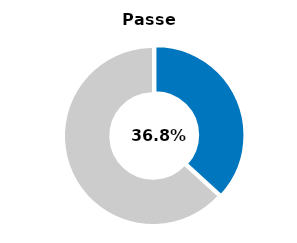
| Category | Series 0 |
|---|---|
| Passed | 0.368 |
| Other | 0.632 |